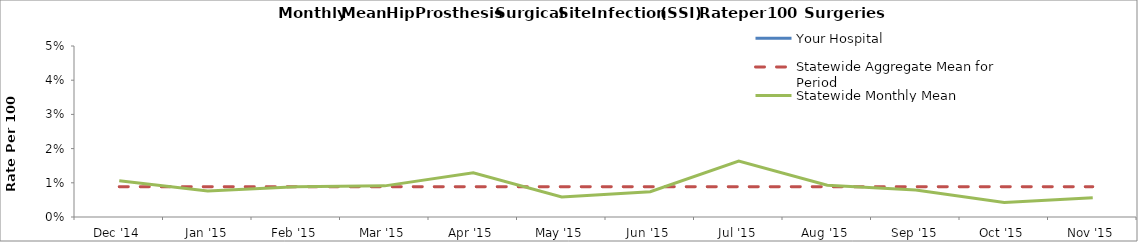
| Category | Your Hospital | Statewide Aggregate Mean for Period | Statewide Monthly Mean |
|---|---|---|---|
| Dec '14 |  | 0.009 | 0.011 |
| Jan '15 |  | 0.009 | 0.008 |
| Feb '15 |  | 0.009 | 0.009 |
| Mar '15 |  | 0.009 | 0.009 |
| Apr '15 |  | 0.009 | 0.013 |
| May '15 |  | 0.009 | 0.006 |
| Jun '15 |  | 0.009 | 0.007 |
| Jul '15 |  | 0.009 | 0.016 |
| Aug '15 |  | 0.009 | 0.009 |
| Sep '15 |  | 0.009 | 0.008 |
| Oct '15 |  | 0.009 | 0.004 |
| Nov '15 |  | 0.009 | 0.006 |